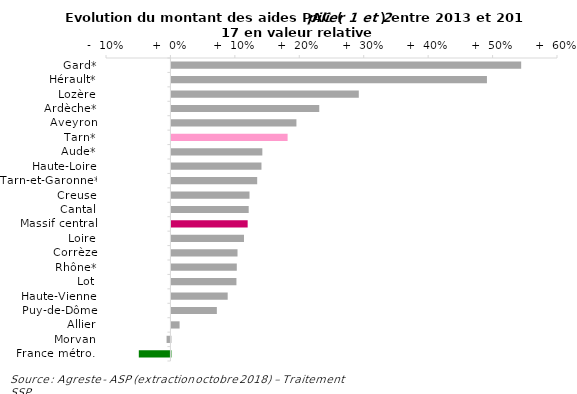
| Category | Evolution du montant
Valeur absolue
En millions d’euros |
|---|---|
| Gard* | 0.543 |
| Hérault* | 0.49 |
| Lozère | 0.291 |
| Ardèche* | 0.229 |
| Aveyron | 0.194 |
| Tarn* | 0.18 |
| Aude* | 0.141 |
| Haute-Loire | 0.14 |
| Tarn-et-Garonne* | 0.133 |
| Creuse | 0.121 |
| Cantal | 0.12 |
| Massif central | 0.118 |
| Loire | 0.113 |
| Corrèze | 0.103 |
| Rhône* | 0.101 |
| Lot | 0.101 |
| Haute-Vienne | 0.087 |
| Puy-de-Dôme | 0.071 |
| Allier | 0.013 |
| Morvan | -0.006 |
| France métro.  | -0.049 |